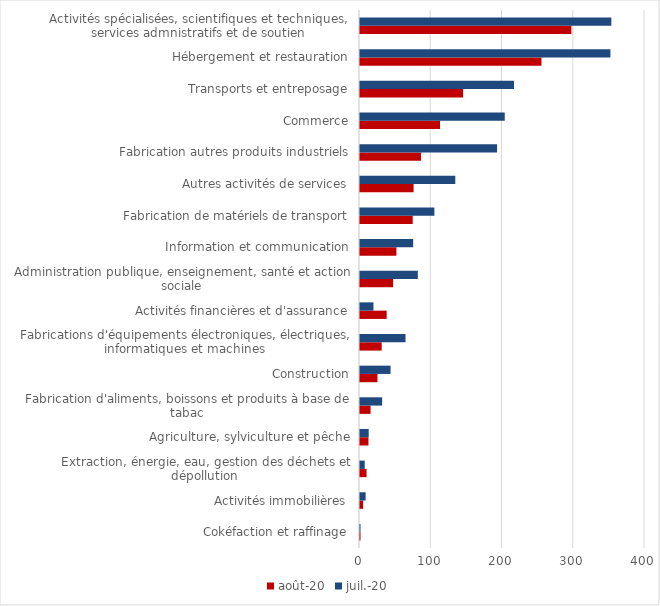
| Category | août-20 | juil.-20 |
|---|---|---|
| Cokéfaction et raffinage | 0.727 | 0.71 |
| Activités immobilières | 4.409 | 7.954 |
| Extraction, énergie, eau, gestion des déchets et dépollution | 9.185 | 6.633 |
| Agriculture, sylviculture et pêche | 11.869 | 12.212 |
| Fabrication d'aliments, boissons et produits à base de tabac | 14.832 | 31.109 |
| Construction | 24.537 | 42.89 |
| Fabrications d'équipements électroniques, électriques, informatiques et machines | 30.436 | 63.906 |
| Activités financières et d'assurance | 37.428 | 18.879 |
| Administration publique, enseignement, santé et action sociale | 46.517 | 81.144 |
| Information et communication | 51.094 | 74.644 |
| Fabrication de matériels de transport | 73.971 | 104.411 |
| Autres activités de services | 75.194 | 133.736 |
| Fabrication autres produits industriels | 85.567 | 192.375 |
| Commerce | 112.306 | 203.155 |
| Transports et entreposage | 144.725 | 216.166 |
| Hébergement et restauration | 254.683 | 351.443 |
| Activités spécialisées, scientifiques et techniques, services admnistratifs et de soutien | 296.672 | 352.76 |